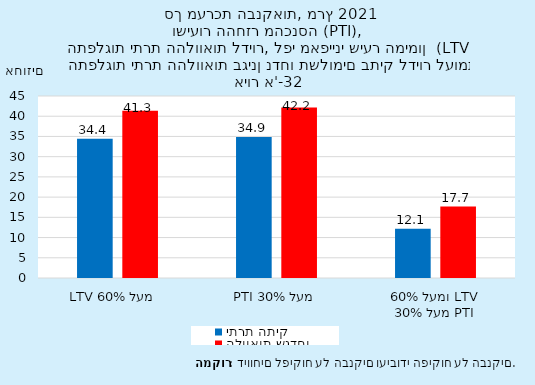
| Category | יתרת התיק | הלוואות שנדחו |
|---|---|---|
| LTV מעל 60%  | 34.448 | 41.34 |
| PTI מעל 30% | 34.892 | 42.183 |
| מעל 30% PTI
ומעל 60% LTV | 12.148 | 17.675 |